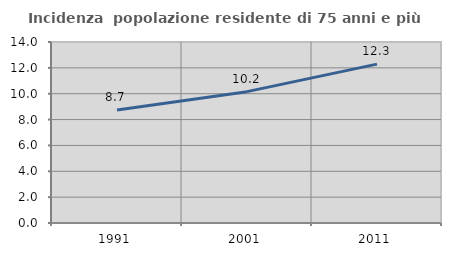
| Category | Incidenza  popolazione residente di 75 anni e più |
|---|---|
| 1991.0 | 8.748 |
| 2001.0 | 10.16 |
| 2011.0 | 12.287 |